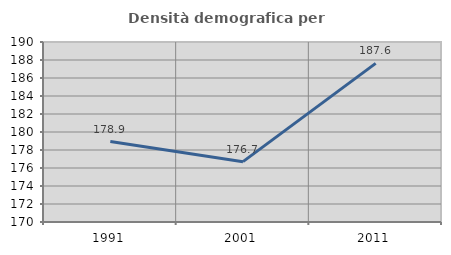
| Category | Densità demografica |
|---|---|
| 1991.0 | 178.939 |
| 2001.0 | 176.706 |
| 2011.0 | 187.626 |